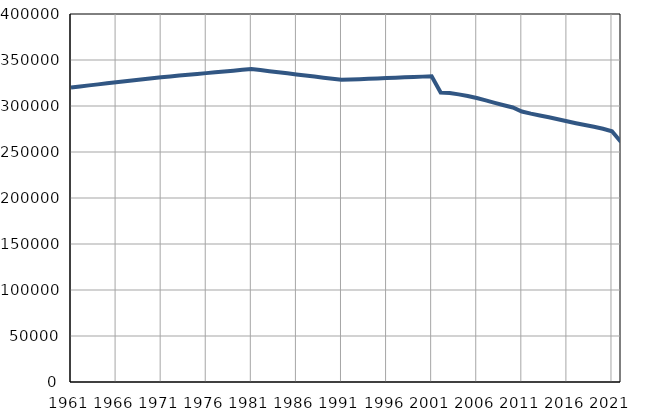
| Category | Population
size |
|---|---|
| 1961.0 | 320187 |
| 1962.0 | 321297 |
| 1963.0 | 322407 |
| 1964.0 | 323516 |
| 1965.0 | 324626 |
| 1966.0 | 325736 |
| 1967.0 | 326846 |
| 1968.0 | 327956 |
| 1969.0 | 329065 |
| 1970.0 | 330175 |
| 1971.0 | 331285 |
| 1972.0 | 332175 |
| 1973.0 | 333066 |
| 1974.0 | 333956 |
| 1975.0 | 334847 |
| 1976.0 | 335737 |
| 1977.0 | 336627 |
| 1978.0 | 337518 |
| 1979.0 | 338408 |
| 1980.0 | 339299 |
| 1981.0 | 340189 |
| 1982.0 | 339013 |
| 1983.0 | 337837 |
| 1984.0 | 336661 |
| 1985.0 | 335485 |
| 1986.0 | 334309 |
| 1987.0 | 333132 |
| 1988.0 | 331956 |
| 1989.0 | 330780 |
| 1990.0 | 329604 |
| 1991.0 | 328428 |
| 1992.0 | 328817 |
| 1993.0 | 329206 |
| 1994.0 | 329595 |
| 1995.0 | 329984 |
| 1996.0 | 330373 |
| 1997.0 | 330761 |
| 1998.0 | 331150 |
| 1999.0 | 331539 |
| 2000.0 | 331928 |
| 2001.0 | 332317 |
| 2002.0 | 314658 |
| 2003.0 | 314082 |
| 2004.0 | 312621 |
| 2005.0 | 310862 |
| 2006.0 | 308706 |
| 2007.0 | 306133 |
| 2008.0 | 303392 |
| 2009.0 | 300874 |
| 2010.0 | 298400 |
| 2011.0 | 294043 |
| 2012.0 | 291686 |
| 2013.0 | 289766 |
| 2014.0 | 287739 |
| 2015.0 | 285597 |
| 2016.0 | 283350 |
| 2017.0 | 281203 |
| 2018.0 | 279281 |
| 2019.0 | 277393 |
| 2020.0 | 275289 |
| 2021.0 | 272560 |
| 2022.0 | 260906 |